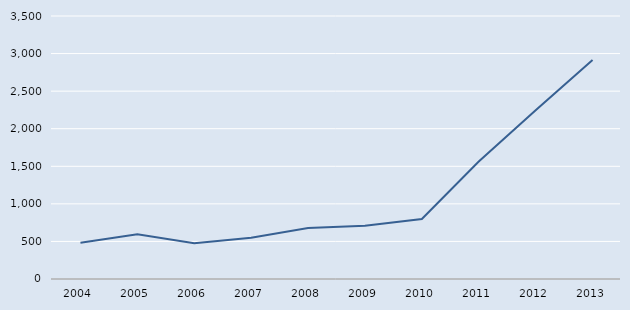
| Category | Series 0 |
|---|---|
| 2004.0 | 482 |
| 2005.0 | 595 |
| 2006.0 | 477 |
| 2007.0 | 550 |
| 2008.0 | 679 |
| 2009.0 | 708 |
| 2010.0 | 798 |
| 2011.0 | 1564 |
| 2012.0 | 2247 |
| 2013.0 | 2913 |